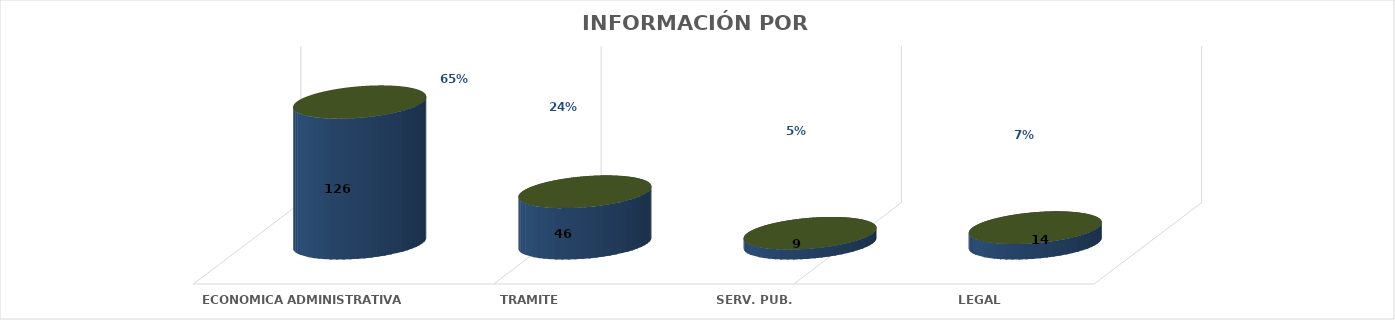
| Category | Series 0 | Series 1 | Series 2 | Series 3 | Series 4 |
|---|---|---|---|---|---|
| ECONOMICA ADMINISTRATIVA |  |  |  | 126 | 0.646 |
| TRAMITE |  |  |  | 46 | 0.236 |
| SERV. PUB. |  |  |  | 9 | 0.046 |
| LEGAL |  |  |  | 14 | 0.072 |